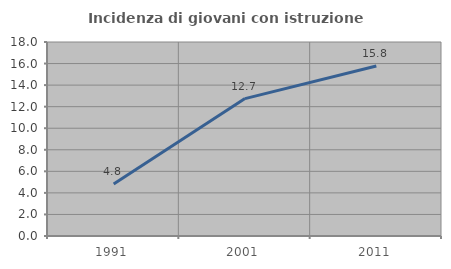
| Category | Incidenza di giovani con istruzione universitaria |
|---|---|
| 1991.0 | 4.834 |
| 2001.0 | 12.747 |
| 2011.0 | 15.776 |